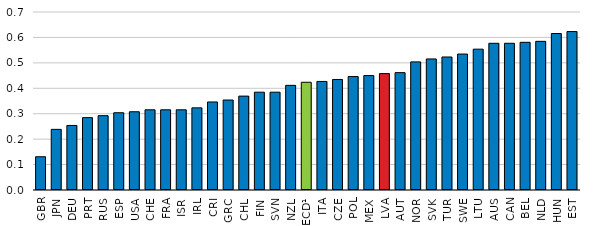
| Category | insol13 |
|---|---|
| GBR | 0.131 |
| JPN | 0.238 |
| DEU | 0.254 |
| PRT | 0.285 |
| RUS | 0.292 |
| ESP | 0.304 |
| USA | 0.308 |
| CHE | 0.315 |
| FRA | 0.315 |
| ISR | 0.315 |
| IRL | 0.323 |
| CRI | 0.346 |
| GRC | 0.354 |
| CHL | 0.369 |
| FIN | 0.385 |
| SVN | 0.385 |
| NZL | 0.412 |
| OECD¹ | 0.424 |
| ITA | 0.427 |
| CZE | 0.435 |
| POL | 0.446 |
| MEX | 0.45 |
| LVA | 0.458 |
| AUT | 0.462 |
| NOR | 0.504 |
| SVK | 0.515 |
| TUR | 0.523 |
| SWE | 0.535 |
| LTU | 0.554 |
| AUS | 0.577 |
| CAN | 0.577 |
| BEL | 0.581 |
| NLD | 0.585 |
| HUN | 0.615 |
| EST | 0.623 |